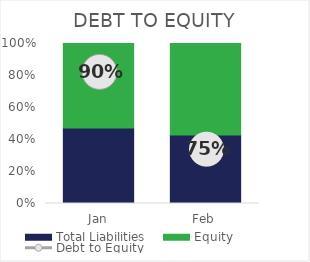
| Category | Total Liabilities | Equity |
|---|---|---|
| Jan | 215 | 240 |
| Feb | 208 | 277 |